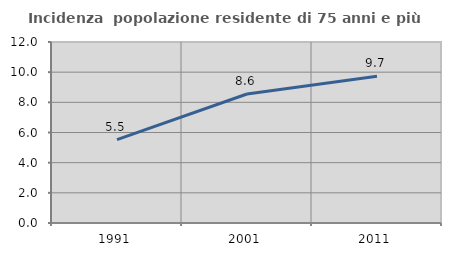
| Category | Incidenza  popolazione residente di 75 anni e più |
|---|---|
| 1991.0 | 5.532 |
| 2001.0 | 8.555 |
| 2011.0 | 9.724 |